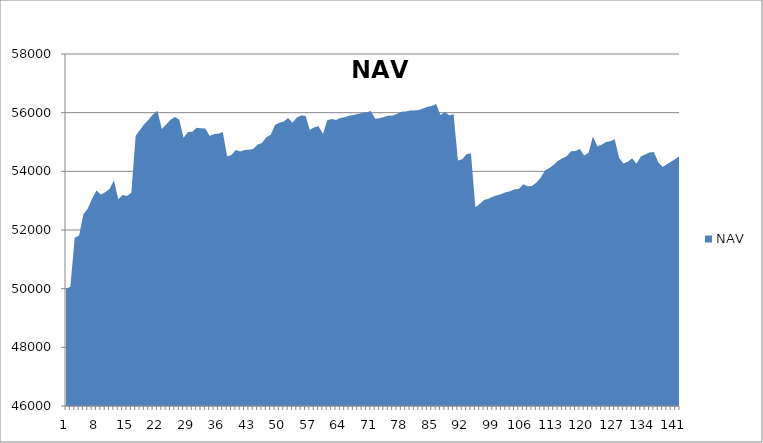
| Category | NAV |
|---|---|
| 0 | 50000 |
| 1 | 50069.444 |
| 2 | 51736.444 |
| 3 | 51809.343 |
| 4 | 52539.343 |
| 5 | 52733.57 |
| 6 | 53070.527 |
| 7 | 53346.212 |
| 8 | 53210.13 |
| 9 | 53285.788 |
| 10 | 53396.685 |
| 11 | 53684.185 |
| 12 | 53050.597 |
| 13 | 53191.058 |
| 14 | 53162.649 |
| 15 | 53270.317 |
| 16 | 55214.762 |
| 17 | 55418.583 |
| 18 | 55617.273 |
| 19 | 55770.477 |
| 20 | 55945.477 |
| 21 | 56069.601 |
| 22 | 55444.601 |
| 23 | 55597.925 |
| 24 | 55757.558 |
| 25 | 55851.308 |
| 26 | 55764.06 |
| 27 | 55148.361 |
| 28 | 55340.028 |
| 29 | 55349.317 |
| 30 | 55485.393 |
| 31 | 55468.704 |
| 32 | 55461.038 |
| 33 | 55205.356 |
| 34 | 55270.356 |
| 35 | 55282.57 |
| 36 | 55341.011 |
| 37 | 54517.482 |
| 38 | 54554.291 |
| 39 | 54731.016 |
| 40 | 54679.093 |
| 41 | 54730.595 |
| 42 | 54736.73 |
| 43 | 54765.085 |
| 44 | 54915.643 |
| 45 | 54969.86 |
| 46 | 55164.665 |
| 47 | 55247.746 |
| 48 | 55575.668 |
| 49 | 55657.905 |
| 50 | 55701.032 |
| 51 | 55819.28 |
| 52 | 55652.834 |
| 53 | 55838.604 |
| 54 | 55905.769 |
| 55 | 55898.888 |
| 56 | 55410.9 |
| 57 | 55504.564 |
| 58 | 55537.603 |
| 59 | 55268.471 |
| 60 | 55737.858 |
| 61 | 55785.708 |
| 62 | 55749.829 |
| 63 | 55815.591 |
| 64 | 55842.34 |
| 65 | 55894.021 |
| 66 | 55916.828 |
| 67 | 55955.697 |
| 68 | 55991.896 |
| 69 | 56012.065 |
| 70 | 56060.293 |
| 71 | 55791.443 |
| 72 | 55810.674 |
| 73 | 55852.843 |
| 74 | 55892.018 |
| 75 | 55900.069 |
| 76 | 55955.739 |
| 77 | 56030.918 |
| 78 | 56036.168 |
| 79 | 56069.975 |
| 80 | 56071.656 |
| 81 | 56090.406 |
| 82 | 56141.798 |
| 83 | 56199.159 |
| 84 | 56228.237 |
| 85 | 56292.573 |
| 86 | 55924.369 |
| 87 | 56019.106 |
| 88 | 55916.165 |
| 89 | 55950.09 |
| 90 | 54367.13 |
| 91 | 54411.811 |
| 92 | 54588.933 |
| 93 | 54611.197 |
| 94 | 52777.117 |
| 95 | 52883.107 |
| 96 | 53025.651 |
| 97 | 53064.908 |
| 98 | 53135.652 |
| 99 | 53186.005 |
| 100 | 53229.789 |
| 101 | 53290.192 |
| 102 | 53319.038 |
| 103 | 53392.112 |
| 104 | 53401.462 |
| 105 | 53559.878 |
| 106 | 53489.526 |
| 107 | 53501.684 |
| 108 | 53607.597 |
| 109 | 53785.178 |
| 110 | 54030.211 |
| 111 | 54113.452 |
| 112 | 54226.272 |
| 113 | 54358.625 |
| 114 | 54444.736 |
| 115 | 54518.421 |
| 116 | 54681.882 |
| 117 | 54693.454 |
| 118 | 54759.719 |
| 119 | 54542.637 |
| 120 | 54631.804 |
| 121 | 55189.582 |
| 122 | 54857.283 |
| 123 | 54902.45 |
| 124 | 54998.878 |
| 125 | 55024.352 |
| 126 | 55097.595 |
| 127 | 54460.788 |
| 128 | 54265.386 |
| 129 | 54330.201 |
| 130 | 54444.032 |
| 131 | 54258.967 |
| 132 | 54502.531 |
| 133 | 54576.689 |
| 134 | 54645.616 |
| 135 | 54655.645 |
| 136 | 54306.491 |
| 137 | 54146.917 |
| 138 | 54245.601 |
| 139 | 54336.218 |
| 140 | 54425.943 |
| 141 | 54524.223 |